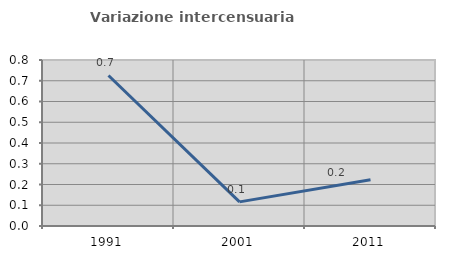
| Category | Variazione intercensuaria annua |
|---|---|
| 1991.0 | 0.725 |
| 2001.0 | 0.116 |
| 2011.0 | 0.223 |